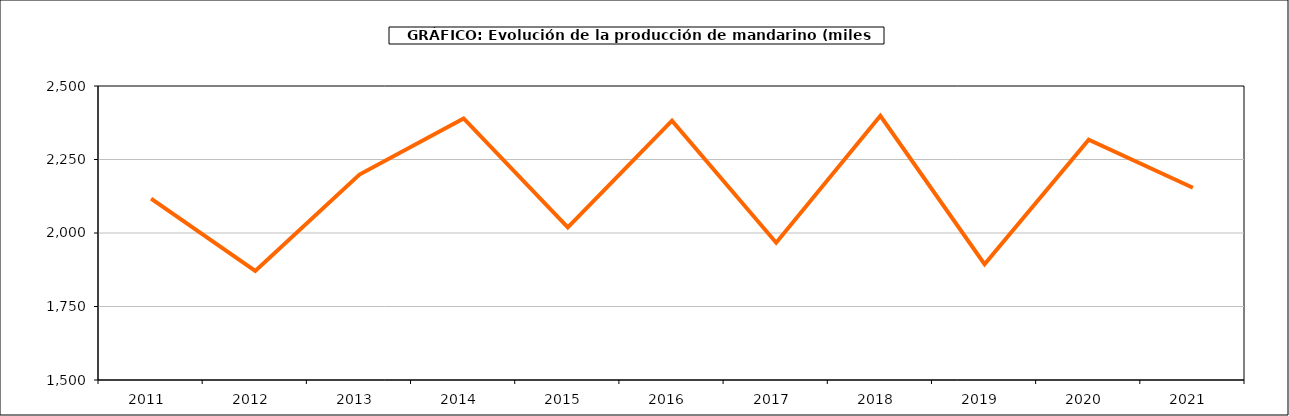
| Category | producción |
|---|---|
| 2011.0 | 2117.119 |
| 2012.0 | 1871.265 |
| 2013.0 | 2198.926 |
| 2014.0 | 2389.894 |
| 2015.0 | 2018.755 |
| 2016.0 | 2382.073 |
| 2017.0 | 1967.018 |
| 2018.0 | 2398.621 |
| 2019.0 | 1893.951 |
| 2020.0 | 2317.019 |
| 2021.0 | 2153.755 |